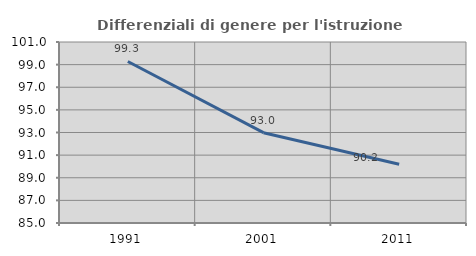
| Category | Differenziali di genere per l'istruzione superiore |
|---|---|
| 1991.0 | 99.277 |
| 2001.0 | 92.985 |
| 2011.0 | 90.2 |